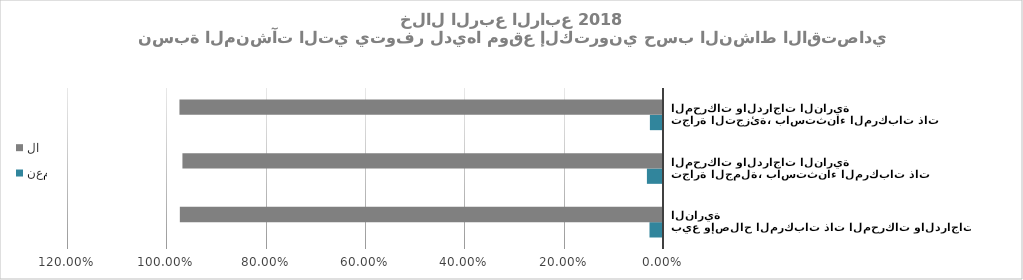
| Category | نعم | لا |
|---|---|---|
| بيع وإصلاح المركبات ذات المحركات والدراجات النارية | 0.027 | 0.973 |
| تجارة الجملة، باستثناء المركبات ذات المحركات والدراجات النارية | 0.032 | 0.968 |
| تجارة التجزئة، باستثناء المركبات ذات المحركات والدراجات النارية | 0.026 | 0.974 |